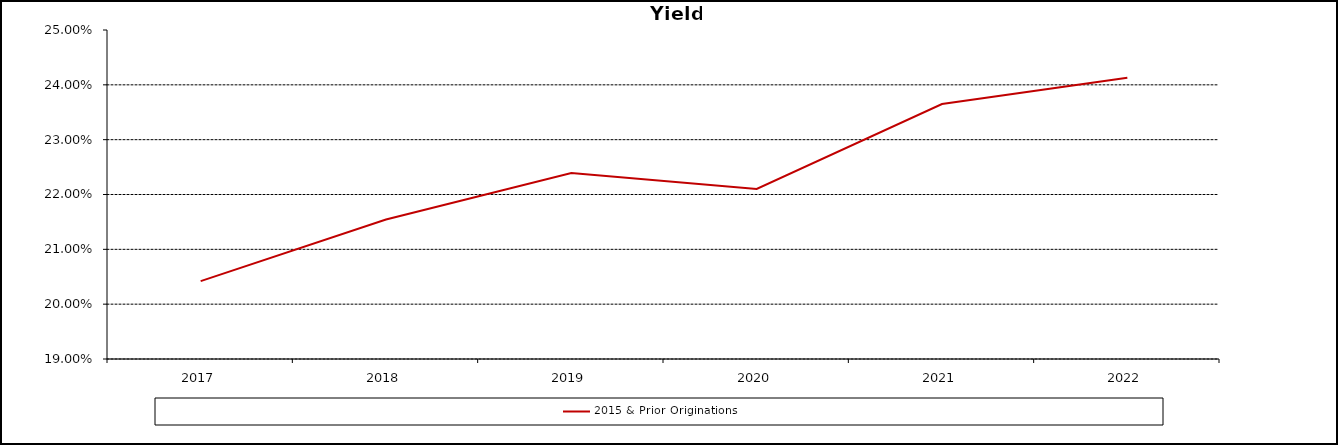
| Category | 2015 & Prior Originations |
|---|---|
| 2017.0 | 0.204 |
| 2018.0 | 0.215 |
| 2019.0 | 0.224 |
| 2020.0 | 0.221 |
| 2021.0 | 0.236 |
| 2022.0 | 0.241 |